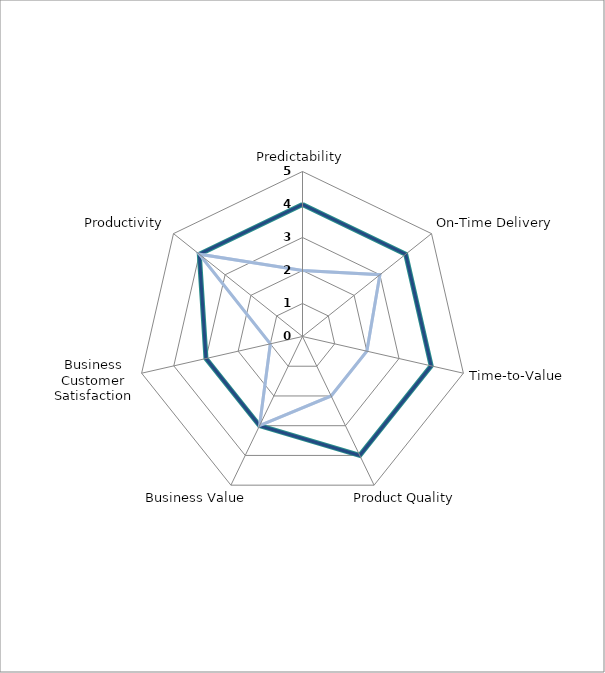
| Category | Series 2 | Series 3 | Series 0 | Series 1 |
|---|---|---|---|---|
| Predictability | 4 | 2 | 4 | 2 |
| On-Time Delivery | 4 | 3 | 4 | 3 |
| Time-to-Value | 4 | 2 | 4 | 2 |
| Product Quality | 4 | 2 | 4 | 2 |
| Business Value | 3 | 3 | 3 | 3 |
| Business Customer Satisfaction | 3 | 1 | 3 | 1 |
| Productivity | 4 | 4 | 4 | 4 |